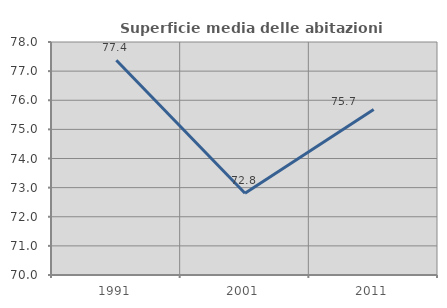
| Category | Superficie media delle abitazioni occupate |
|---|---|
| 1991.0 | 77.373 |
| 2001.0 | 72.808 |
| 2011.0 | 75.682 |